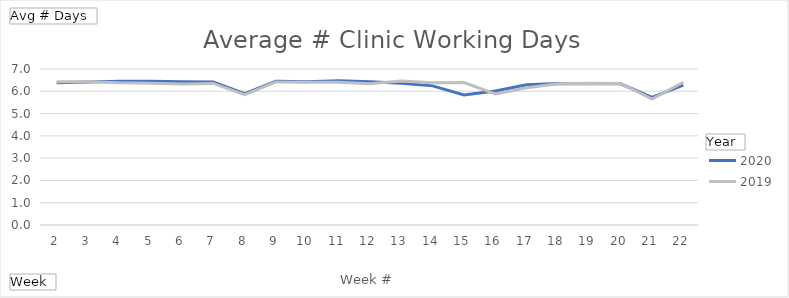
| Category | 2020 | 2019 |
|---|---|---|
| 2 | 6.378 | 6.432 |
| 3 | 6.419 | 6.432 |
| 4 | 6.446 | 6.378 |
| 5 | 6.446 | 6.365 |
| 6 | 6.432 | 6.324 |
| 7 | 6.419 | 6.351 |
| 8 | 5.892 | 5.851 |
| 9 | 6.446 | 6.419 |
| 10 | 6.432 | 6.405 |
| 11 | 6.473 | 6.405 |
| 12 | 6.432 | 6.338 |
| 13 | 6.365 | 6.459 |
| 14 | 6.243 | 6.378 |
| 15 | 5.838 | 6.392 |
| 16 | 6.014 | 5.878 |
| 17 | 6.297 | 6.162 |
| 18 | 6.351 | 6.338 |
| 19 | 6.338 | 6.365 |
| 20 | 6.338 | 6.351 |
| 21 | 5.73 | 5.649 |
| 22 | 6.274 | 6.405 |